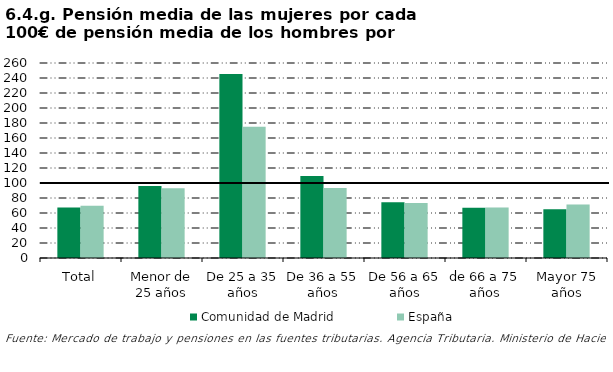
| Category | Comunidad de Madrid | España |
|---|---|---|
| Total | 67.186 | 69.805 |
| Menor de 25 años | 95.982 | 93.031 |
| De 25 a 35 años | 245.423 | 174.835 |
| De 36 a 55 años | 109.377 | 93.241 |
| De 56 a 65 años | 74.192 | 73.223 |
| de 66 a 75 años | 67.047 | 67.194 |
| Mayor 75 años | 64.862 | 71.327 |